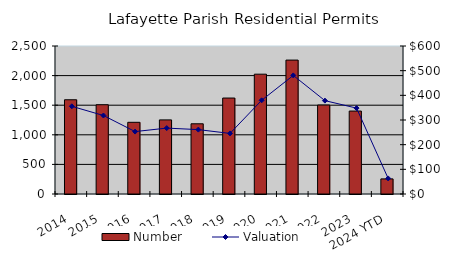
| Category | Number |
|---|---|
| 2014 | 1592 |
| 2015 | 1508 |
| 2016 | 1211 |
| 2017 | 1252 |
| 2018 | 1186 |
| 2019 | 1621 |
| 2020 | 2024 |
| 2021 | 2262 |
| 2022 | 1503 |
| 2023 | 1401 |
| 2024 YTD | 255 |